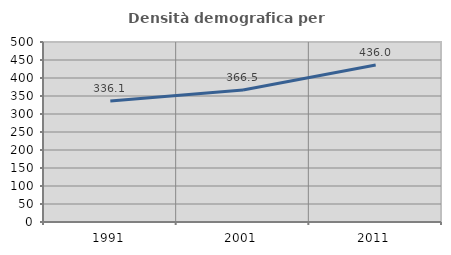
| Category | Densità demografica |
|---|---|
| 1991.0 | 336.089 |
| 2001.0 | 366.546 |
| 2011.0 | 435.967 |